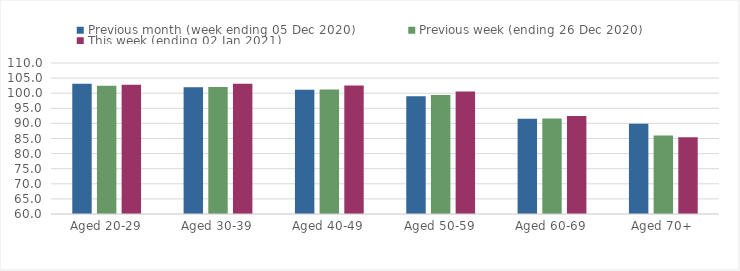
| Category | Previous month (week ending 05 Dec 2020) | Previous week (ending 26 Dec 2020) | This week (ending 02 Jan 2021) |
|---|---|---|---|
| Aged 20-29 | 103.13 | 102.45 | 102.78 |
| Aged 30-39 | 101.99 | 102.03 | 103.1 |
| Aged 40-49 | 101.14 | 101.26 | 102.54 |
| Aged 50-59 | 99 | 99.39 | 100.6 |
| Aged 60-69 | 91.51 | 91.62 | 92.48 |
| Aged 70+ | 89.89 | 85.96 | 85.38 |